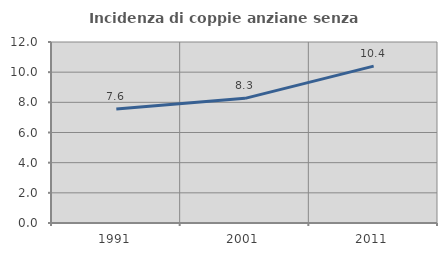
| Category | Incidenza di coppie anziane senza figli  |
|---|---|
| 1991.0 | 7.559 |
| 2001.0 | 8.263 |
| 2011.0 | 10.4 |